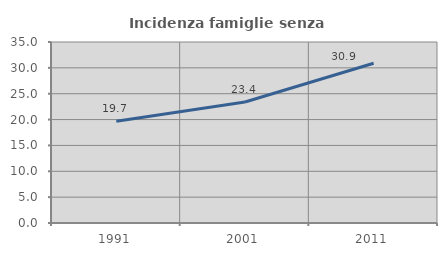
| Category | Incidenza famiglie senza nuclei |
|---|---|
| 1991.0 | 19.676 |
| 2001.0 | 23.404 |
| 2011.0 | 30.894 |